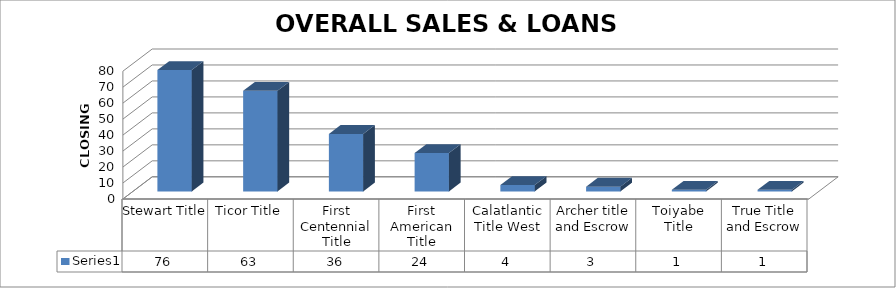
| Category | Series 0 |
|---|---|
| Stewart Title | 76 |
| Ticor Title | 63 |
| First Centennial Title | 36 |
| First American Title | 24 |
| Calatlantic Title West | 4 |
| Archer title and Escrow | 3 |
| Toiyabe Title | 1 |
| True Title and Escrow | 1 |